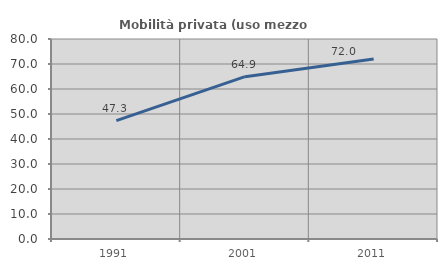
| Category | Mobilità privata (uso mezzo privato) |
|---|---|
| 1991.0 | 47.325 |
| 2001.0 | 64.921 |
| 2011.0 | 72.018 |